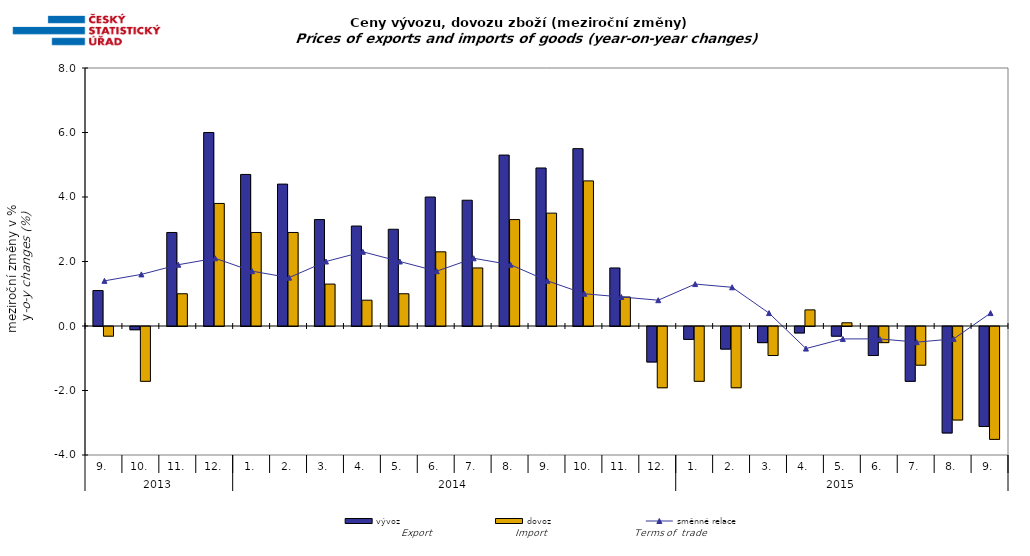
| Category | vývoz | dovoz |
|---|---|---|
| 0 | 1.1 | -0.3 |
| 1 | -0.1 | -1.7 |
| 2 | 2.9 | 1 |
| 3 | 6 | 3.8 |
| 4 | 4.7 | 2.9 |
| 5 | 4.4 | 2.9 |
| 6 | 3.3 | 1.3 |
| 7 | 3.1 | 0.8 |
| 8 | 3 | 1 |
| 9 | 4 | 2.3 |
| 10 | 3.9 | 1.8 |
| 11 | 5.3 | 3.3 |
| 12 | 4.9 | 3.5 |
| 13 | 5.5 | 4.5 |
| 14 | 1.8 | 0.9 |
| 15 | -1.1 | -1.9 |
| 16 | -0.4 | -1.7 |
| 17 | -0.7 | -1.9 |
| 18 | -0.5 | -0.9 |
| 19 | -0.2 | 0.5 |
| 20 | -0.3 | 0.1 |
| 21 | -0.9 | -0.5 |
| 22 | -1.7 | -1.2 |
| 23 | -3.3 | -2.9 |
| 24 | -3.1 | -3.5 |